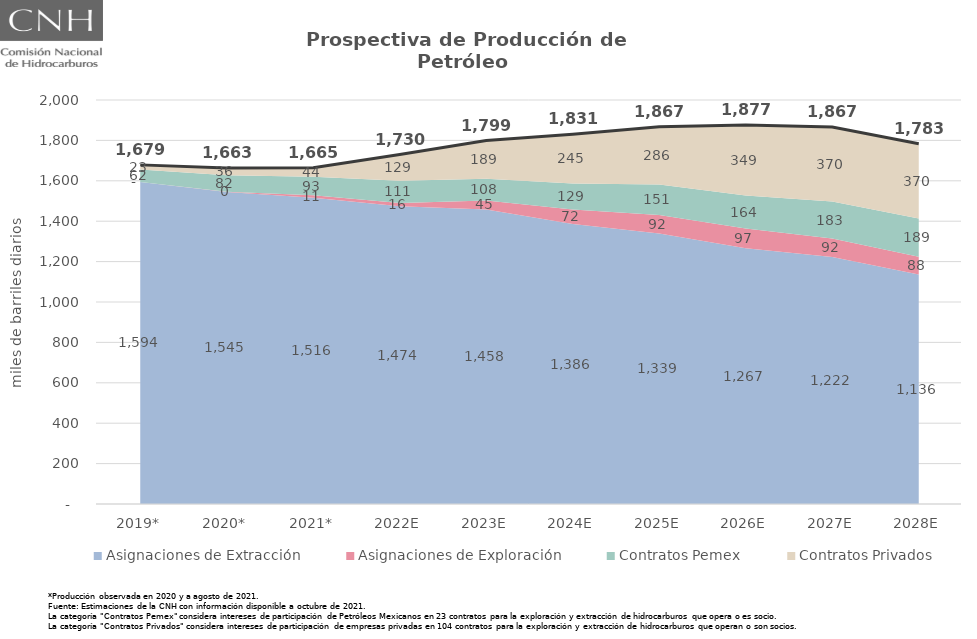
| Category | Total |
|---|---|
| 2019* | 1678.832 |
| 2020* | 1663.043 |
| 2021* | 1664.708 |
| 2022E | 1729.81 |
| 2023E | 1799.458 |
| 2024E | 1830.777 |
| 2025E | 1867.354 |
| 2026E | 1876.537 |
| 2027E | 1866.595 |
| 2028E | 1783.438 |